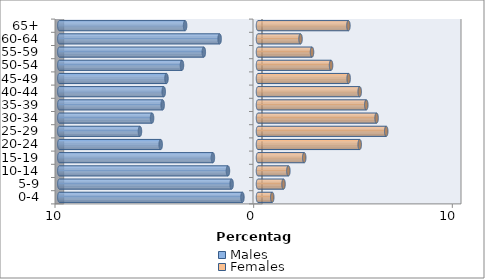
| Category | Males | Females |
|---|---|---|
| 0-4 | -0.784 | 0.717 |
| 5-9 | -1.328 | 1.284 |
| 10-14 | -1.513 | 1.529 |
| 15-19 | -2.271 | 2.327 |
| 20-24 | -4.899 | 5.12 |
| 25-29 | -5.942 | 6.455 |
| 30-34 | -5.333 | 5.969 |
| 35-39 | -4.8 | 5.451 |
| 40-44 | -4.745 | 5.119 |
| 45-49 | -4.607 | 4.563 |
| 50-54 | -3.828 | 3.678 |
| 55-59 | -2.727 | 2.719 |
| 60-64 | -1.931 | 2.141 |
| 65+ | -3.669 | 4.552 |